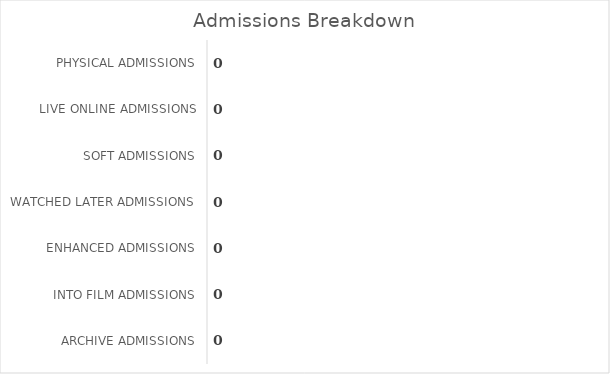
| Category | Series 0 |
|---|---|
| PHYSICAL ADMISSIONS | 0 |
| LIVE ONLINE ADMISSIONS | 0 |
| SOFT ADMISSIONS | 0 |
| WATCHED LATER ADMISSIONS | 0 |
| ENHANCED ADMISSIONS | 0 |
| INTO FILM ADMISSIONS | 0 |
| ARCHIVE ADMISSIONS | 0 |